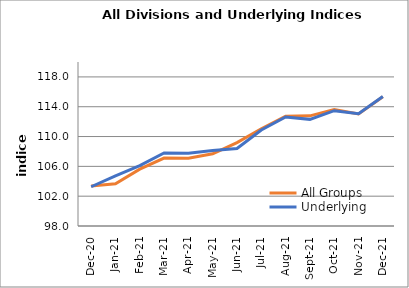
| Category | All Groups | Underlying |
|---|---|---|
| 2020-12-01 | 103.378 | 103.266 |
| 2021-01-01 | 103.671 | 104.733 |
| 2021-02-01 | 105.627 | 106.099 |
| 2021-03-01 | 107.11 | 107.788 |
| 2021-04-01 | 107.082 | 107.772 |
| 2021-05-01 | 107.693 | 108.128 |
| 2021-06-01 | 109.193 | 108.399 |
| 2021-07-01 | 111.039 | 110.883 |
| 2021-08-01 | 112.735 | 112.633 |
| 2021-09-01 | 112.778 | 112.306 |
| 2021-10-01 | 113.609 | 113.469 |
| 2021-11-01 | 113.04 | 113.069 |
| 2021-12-01 | 115.332 | 115.373 |